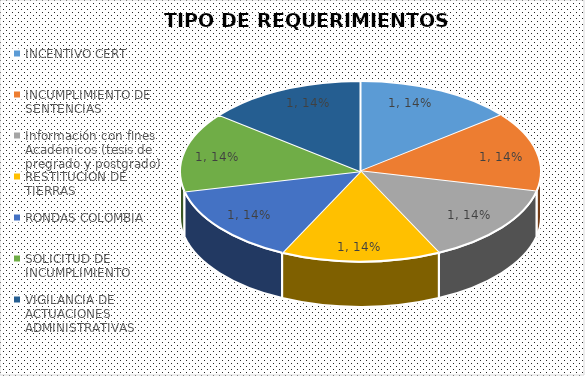
| Category | 1 |
|---|---|
| INCENTIVO CERT | 1 |
| INCUMPLIMIENTO DE SENTENCIAS  | 1 |
| Información con fines Académicos (tesis de pregrado y postgrado) | 1 |
| RESTITUCION DE TIERRAS | 1 |
| RONDAS COLOMBIA | 1 |
| SOLICITUD DE INCUMPLIMIENTO  | 1 |
| VIGILANCIA DE ACTUACIONES ADMINISTRATIVAS  | 1 |